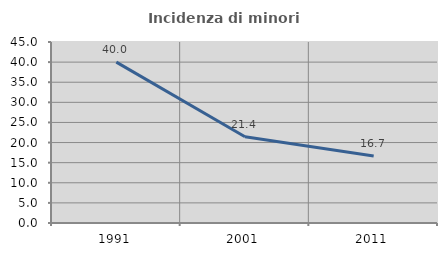
| Category | Incidenza di minori stranieri |
|---|---|
| 1991.0 | 40 |
| 2001.0 | 21.429 |
| 2011.0 | 16.667 |